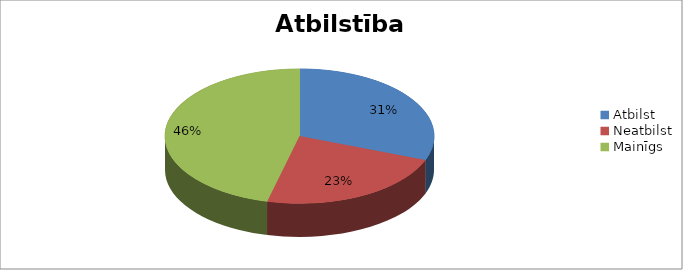
| Category | Series 0 |
|---|---|
| Atbilst | 4 |
| Neatbilst | 3 |
| Mainīgs | 6 |